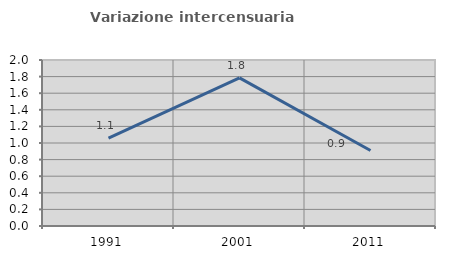
| Category | Variazione intercensuaria annua |
|---|---|
| 1991.0 | 1.059 |
| 2001.0 | 1.785 |
| 2011.0 | 0.909 |